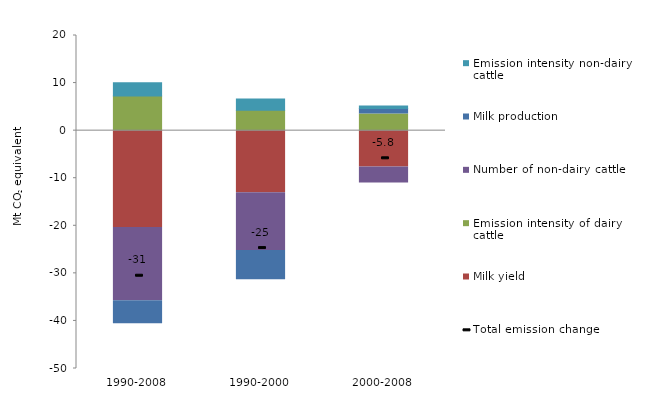
| Category | Milk yield | Emission intensity of dairy cattle | Number of non-dairy cattle | Milk production | Emission intensity non-dairy cattle |
|---|---|---|---|---|---|
| 1990-2008 | -20.384 | 7.281 | -15.371 | -4.82 | 2.794 |
| 1990-2000 | -13.057 | 4.288 | -12.117 | -6.152 | 2.354 |
| 2000-2008 | -7.643 | 3.489 | -3.373 | 1.152 | 0.559 |